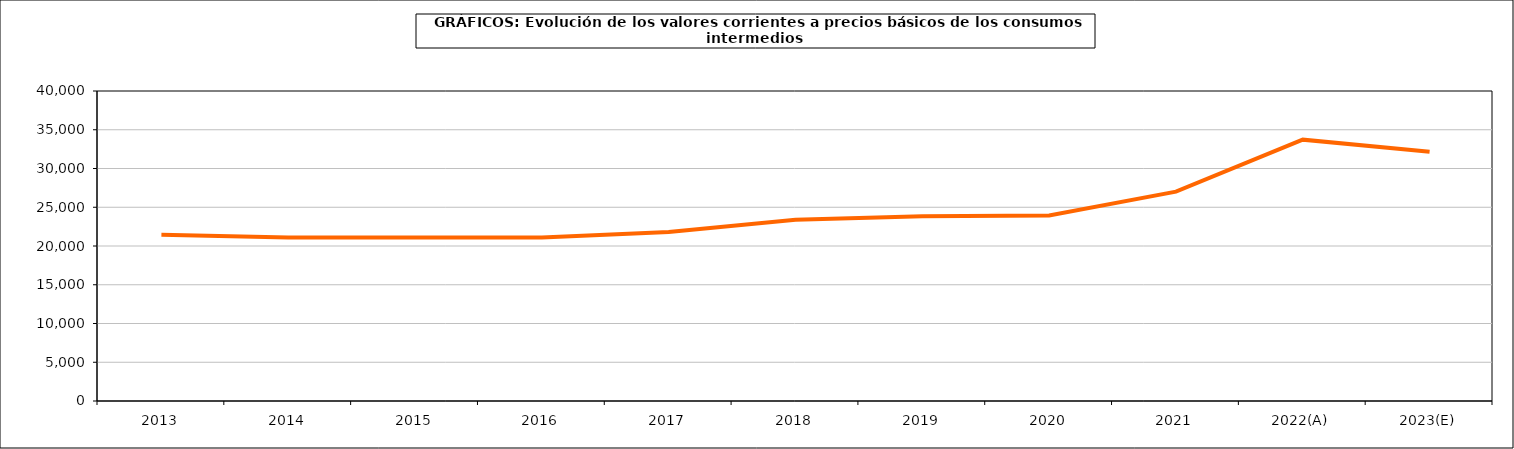
| Category | Total consumos intermedios |
|---|---|
| 2013 | 21445.2 |
| 2014 | 21097.4 |
| 2015 | 21104.1 |
| 2016 | 21083.6 |
| 2017 | 21794.5 |
| 2018 | 23401.5 |
| 2019 | 23844.5 |
| 2020 | 23945.8 |
| 2021 | 27015.5 |
| 2022(A) | 33723.1 |
| 2023(E) | 32155.1 |